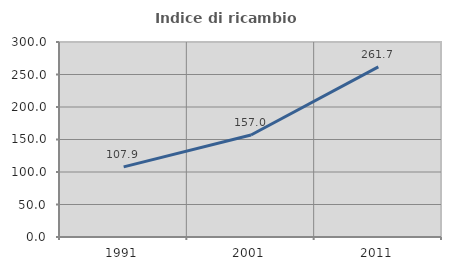
| Category | Indice di ricambio occupazionale  |
|---|---|
| 1991.0 | 107.889 |
| 2001.0 | 156.973 |
| 2011.0 | 261.71 |